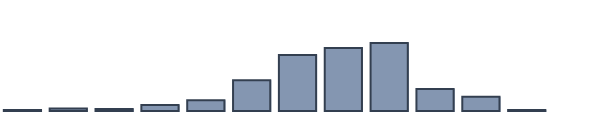
| Category | Series 0 |
|---|---|
| 0 | 0.348 |
| 1 | 0.913 |
| 2 | 0.696 |
| 3 | 2.174 |
| 4 | 3.87 |
| 5 | 11.043 |
| 6 | 20.217 |
| 7 | 22.739 |
| 8 | 24.522 |
| 9 | 7.957 |
| 10 | 5.13 |
| 11 | 0.391 |
| 12 | 0 |